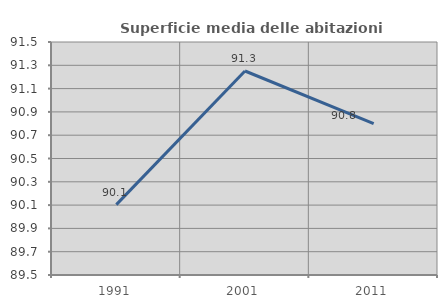
| Category | Superficie media delle abitazioni occupate |
|---|---|
| 1991.0 | 90.104 |
| 2001.0 | 91.251 |
| 2011.0 | 90.799 |